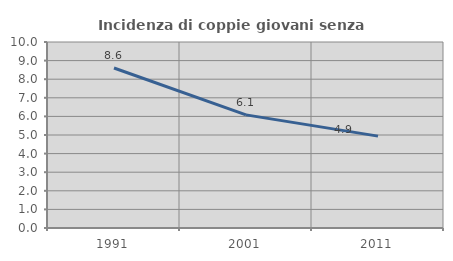
| Category | Incidenza di coppie giovani senza figli |
|---|---|
| 1991.0 | 8.602 |
| 2001.0 | 6.081 |
| 2011.0 | 4.94 |